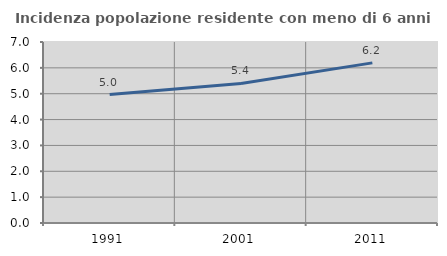
| Category | Incidenza popolazione residente con meno di 6 anni |
|---|---|
| 1991.0 | 4.965 |
| 2001.0 | 5.396 |
| 2011.0 | 6.193 |